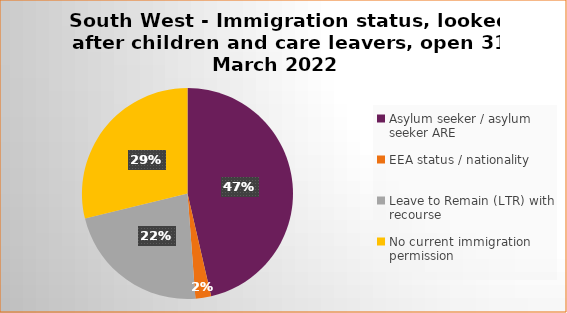
| Category | Number  | Percentage |
|---|---|---|
| Asylum seeker / asylum seeker ARE | 58 | 0.464 |
| EEA status / nationality  | 3 | 0.024 |
| Leave to Remain (LTR) with recourse | 28 | 0.224 |
| No current immigration permission | 36 | 0.288 |